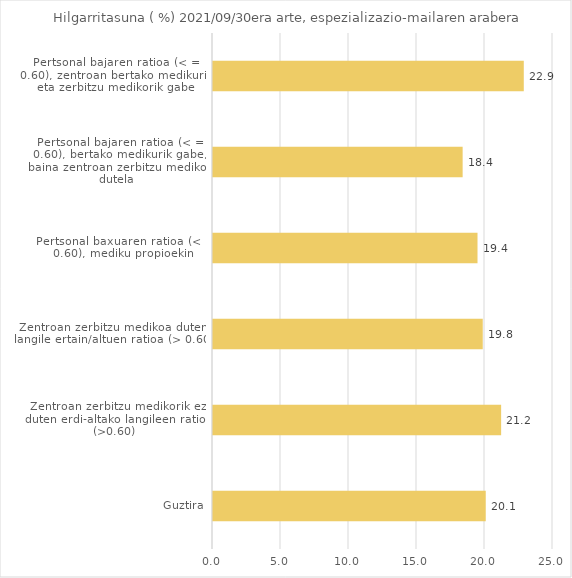
| Category | Series 0 |
|---|---|
| Guztira | 20.055 |
| Zentroan zerbitzu medikorik ez duten erdi-altako langileen ratioa (>0.60) | 21.186 |
| Zentroan zerbitzu medikoa duten langile ertain/altuen ratioa (> 0.60) | 19.834 |
| Pertsonal baxuaren ratioa (< = 0.60), mediku propioekin | 19.449 |
| Pertsonal bajaren ratioa (< = 0.60), bertako medikurik gabe, baina zentroan zerbitzu medikoa dutela | 18.356 |
| Pertsonal bajaren ratioa (< = 0.60), zentroan bertako medikurik eta zerbitzu medikorik gabe | 22.852 |